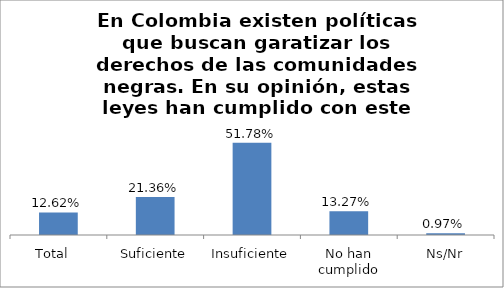
| Category | Total |
|---|---|
| Total   | 0.126 |
| Suficiente | 0.214 |
| Insuficiente | 0.518 |
| No han cumplido | 0.133 |
| Ns/Nr | 0.01 |